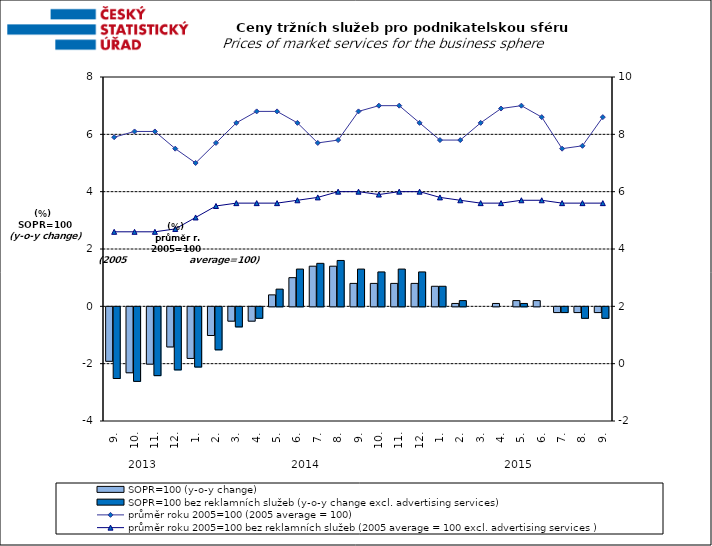
| Category | SOPR=100 (y-o-y change)   | SOPR=100 bez reklamních služeb (y-o-y change excl. advertising services)   |
|---|---|---|
| 0 | -1.9 | -2.5 |
| 1 | -2.3 | -2.6 |
| 2 | -2 | -2.4 |
| 3 | -1.4 | -2.2 |
| 4 | -1.8 | -2.1 |
| 5 | -1 | -1.5 |
| 6 | -0.5 | -0.7 |
| 7 | -0.5 | -0.4 |
| 8 | 0.4 | 0.6 |
| 9 | 1 | 1.3 |
| 10 | 1.4 | 1.5 |
| 11 | 1.4 | 1.6 |
| 12 | 0.8 | 1.3 |
| 13 | 0.8 | 1.2 |
| 14 | 0.8 | 1.3 |
| 15 | 0.8 | 1.2 |
| 16 | 0.7 | 0.7 |
| 17 | 0.1 | 0.2 |
| 18 | 0 | 0 |
| 19 | 0.1 | 0 |
| 20 | 0.2 | 0.1 |
| 21 | 0.2 | 0 |
| 22 | -0.2 | -0.2 |
| 23 | -0.2 | -0.4 |
| 24 | -0.2 | -0.4 |